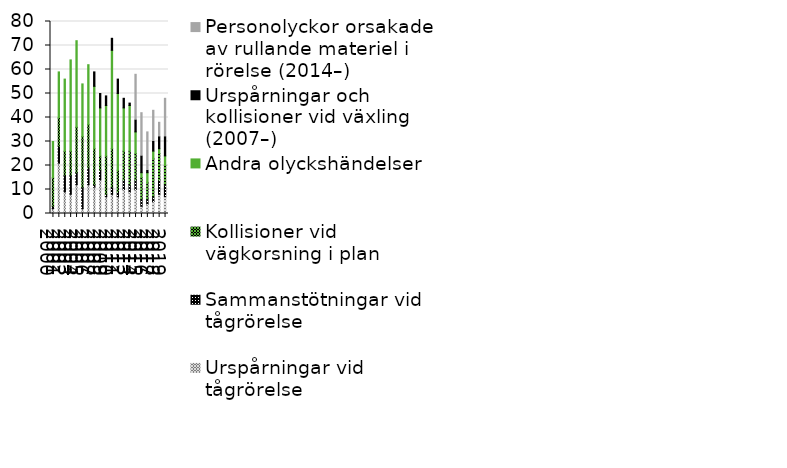
| Category | Urspårningar vid tågrörelse  | Sammanstötningar vid tågrörelse  | Kollisioner vid vägkorsning i plan | Andra olyckshändelser | Urspårningar och kollisioner vid växling  (2007–) | Personolyckor orsakade av rullande materiel i rörelse (2014–) |
|---|---|---|---|---|---|---|
| 2000 | 2 | 1 | 12 | 15 | 0 | 0 |
| 2001 | 21 | 7 | 12 | 19 | 0 | 0 |
| 2002 | 9 | 7 | 10 | 30 | 0 | 0 |
| 2003 | 8 | 8 | 10 | 38 | 0 | 0 |
| 2004 | 12 | 5 | 19 | 36 | 0 | 0 |
| 2005 | 2 | 9 | 21 | 22 | 0 | 0 |
| 2006 | 12 | 7 | 18 | 25 | 0 | 0 |
| 2007 | 11 | 1 | 15 | 26 | 6 | 0 |
| 2008 | 14 | 4 | 6 | 20 | 6 | 0 |
| 2009 | 7 | 1 | 16 | 21 | 4 | 0 |
| 2010 | 8 | 3 | 16 | 41 | 5 | 0 |
| 2011 | 7 | 2 | 9 | 32 | 6 | 0 |
| 2012 | 10 | 4 | 12 | 18 | 4 | 0 |
| 2013 | 9 | 3 | 14 | 19 | 1 | 0 |
| 2014 | 10 | 4 | 11 | 9 | 5 | 19 |
| 2015 | 3 | 3 | 9 | 2 | 7 | 18 |
| 2016 | 4 | 2 | 7 | 4 | 1 | 16 |
| 2017 | 5 | 2 | 16 | 3 | 4 | 13 |
| 2018 | 8 | 6 | 11 | 2 | 5 | 6 |
| 2019 | 7 | 5 | 8 | 4 | 8 | 16 |